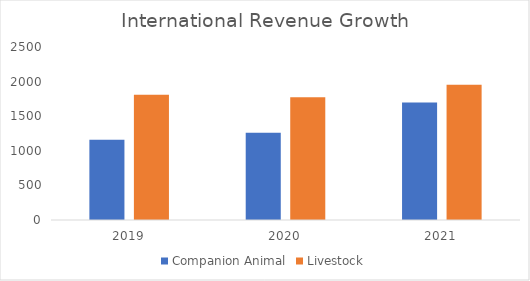
| Category | Companion Animal | Livestock |
|---|---|---|
| 2019.0 | 1161 | 1811 |
| 2020.0 | 1261 | 1774 |
| 2021.0 | 1699 | 1953 |